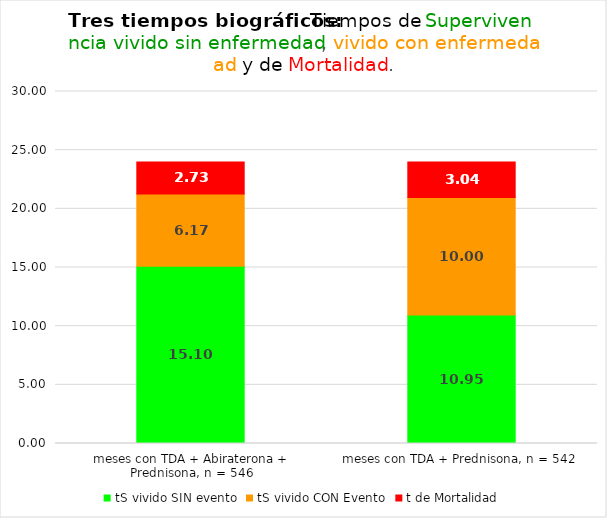
| Category | tS vivido SIN evento | tS vivido CON Evento | t de Mortalidad |
|---|---|---|---|
| meses con TDA + Abiraterona + Prednisona, n = 546 | 15.1 | 6.173 | 2.727 |
| meses con TDA + Prednisona, n = 542 | 10.953 | 10.003 | 3.044 |